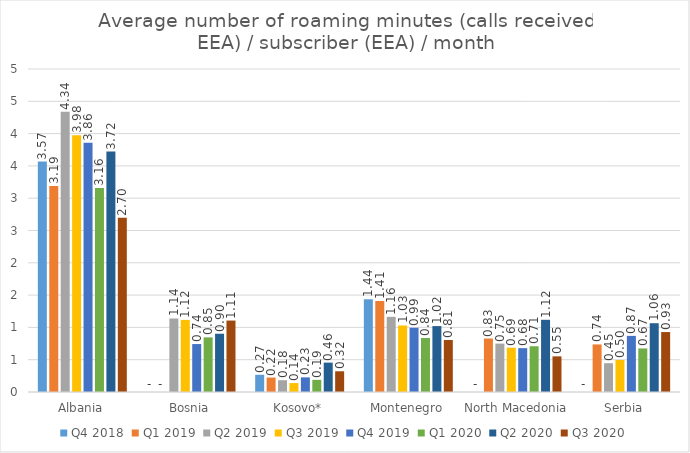
| Category | Q4 2018 | Q1 2019 | Q2 2019 | Q3 2019 | Q4 2019 | Q1 2020 | Q2 2020 | Q3 2020 |
|---|---|---|---|---|---|---|---|---|
| Albania | 3.567 | 3.19 | 4.34 | 3.975 | 3.857 | 3.157 | 3.723 | 2.697 |
| Bosnia | 0 | 0 | 1.138 | 1.116 | 0.742 | 0.846 | 0.902 | 1.106 |
| Kosovo* | 0.266 | 0.224 | 0.183 | 0.138 | 0.227 | 0.188 | 0.455 | 0.321 |
| Montenegro | 1.437 | 1.409 | 1.163 | 1.03 | 0.995 | 0.835 | 1.02 | 0.805 |
| North Macedonia | 0 | 0.828 | 0.749 | 0.686 | 0.679 | 0.708 | 1.118 | 0.552 |
| Serbia | 0 | 0.736 | 0.446 | 0.496 | 0.869 | 0.675 | 1.065 | 0.928 |